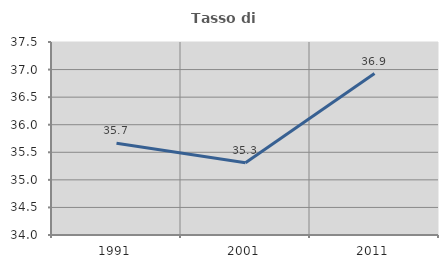
| Category | Tasso di occupazione   |
|---|---|
| 1991.0 | 35.665 |
| 2001.0 | 35.309 |
| 2011.0 | 36.927 |